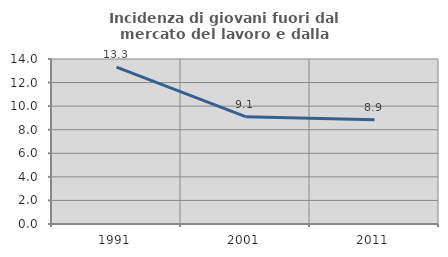
| Category | Incidenza di giovani fuori dal mercato del lavoro e dalla formazione  |
|---|---|
| 1991.0 | 13.313 |
| 2001.0 | 9.103 |
| 2011.0 | 8.853 |